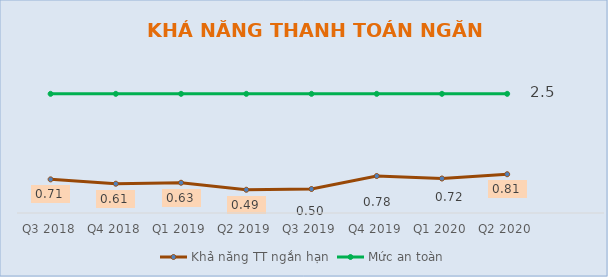
| Category | Khả năng TT ngắn hạn | Mức an toàn |
|---|---|---|
| Q3 2018 | 0.706 | 2.5 |
| Q4 2018 | 0.614 | 2.5 |
| Q1 2019 | 0.635 | 2.5 |
| Q2 2019 | 0.487 | 2.5 |
| Q3 2019 | 0.503 | 2.5 |
| Q4 2019 | 0.776 | 2.5 |
| Q1 2020 | 0.723 | 2.5 |
| Q2 2020 | 0.813 | 2.5 |